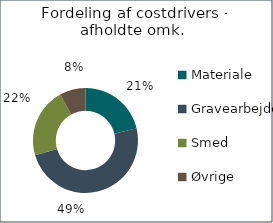
| Category | Series 0 | Andel af endelig anlægssum  |
|---|---|---|
| Materiale  |  | 0.213 |
| Gravearbejde |  | 0.491 |
| Smed |  | 0.216 |
| Øvrige  |  | 0.08 |